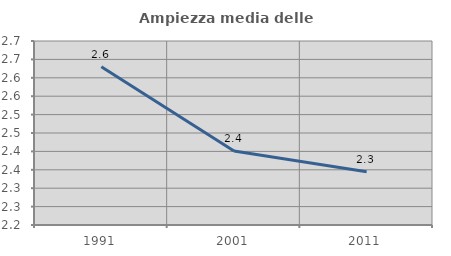
| Category | Ampiezza media delle famiglie |
|---|---|
| 1991.0 | 2.63 |
| 2001.0 | 2.401 |
| 2011.0 | 2.345 |